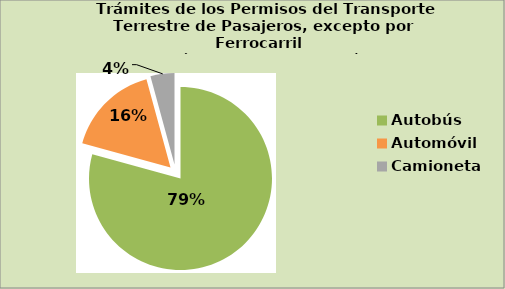
| Category | Series 0 |
|---|---|
| Autobús | 79.233 |
| Automóvil | 16.483 |
| Camioneta | 4.233 |